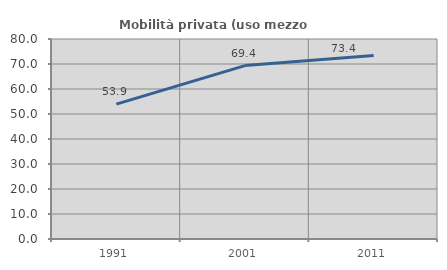
| Category | Mobilità privata (uso mezzo privato) |
|---|---|
| 1991.0 | 53.93 |
| 2001.0 | 69.359 |
| 2011.0 | 73.434 |